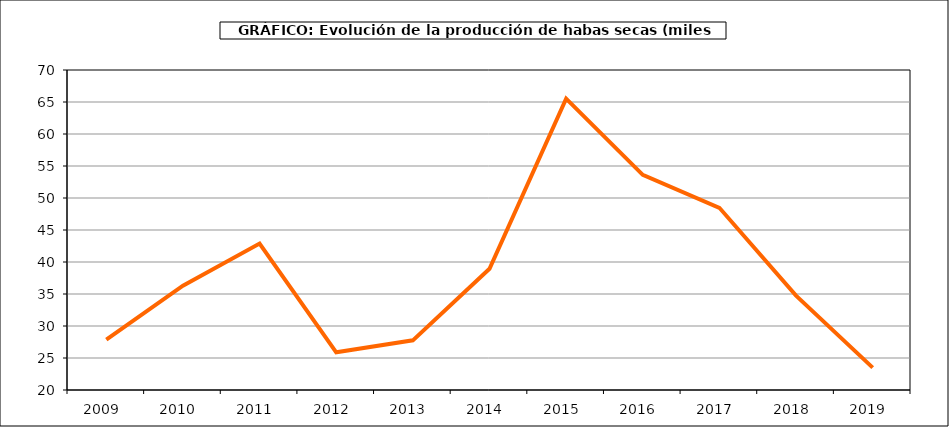
| Category | Producción |
|---|---|
| 2009.0 | 27.866 |
| 2010.0 | 36.305 |
| 2011.0 | 42.882 |
| 2012.0 | 25.888 |
| 2013.0 | 27.759 |
| 2014.0 | 38.941 |
| 2015.0 | 65.532 |
| 2016.0 | 53.625 |
| 2017.0 | 48.468 |
| 2018.0 | 34.75 |
| 2019.0 | 23.492 |